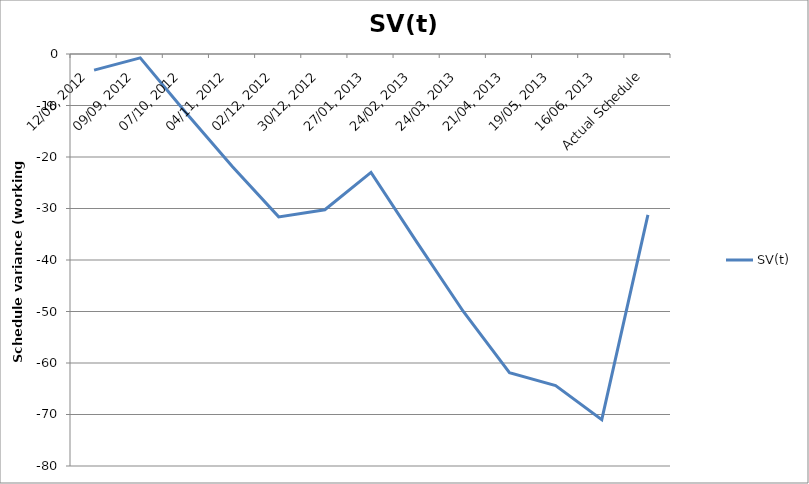
| Category | SV(t) |
|---|---|
| 12/08, 2012 | -3.125 |
| 09/09, 2012 | -0.75 |
| 07/10, 2012 | -11.5 |
| 04/11, 2012 | -21.875 |
| 02/12, 2012 | -31.625 |
| 30/12, 2012 | -30.25 |
| 27/01, 2013 | -23 |
| 24/02, 2013 | -36.625 |
| 24/03, 2013 | -50 |
| 21/04, 2013 | -61.875 |
| 19/05, 2013 | -64.375 |
| 16/06, 2013 | -71 |
| Actual Schedule | -31.25 |